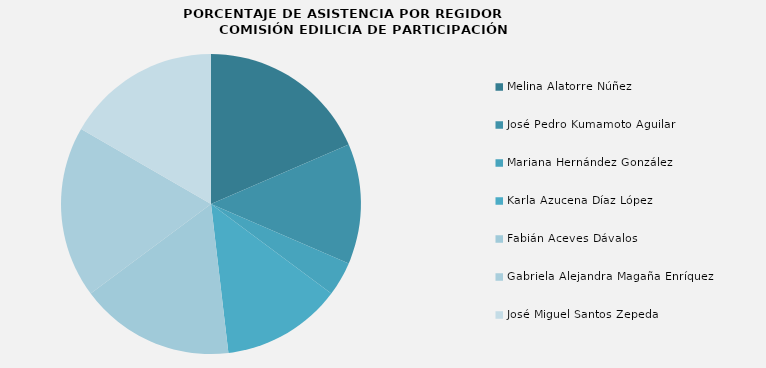
| Category | Melina Alatorre Núñez |
|---|---|
| Melina Alatorre Núñez | 100 |
| José Pedro Kumamoto Aguilar | 70 |
| Mariana Hernández González | 20 |
| Karla Azucena Díaz López | 70 |
| Fabián Aceves Dávalos | 90 |
| Gabriela Alejandra Magaña Enríquez | 100 |
| José Miguel Santos Zepeda | 90 |